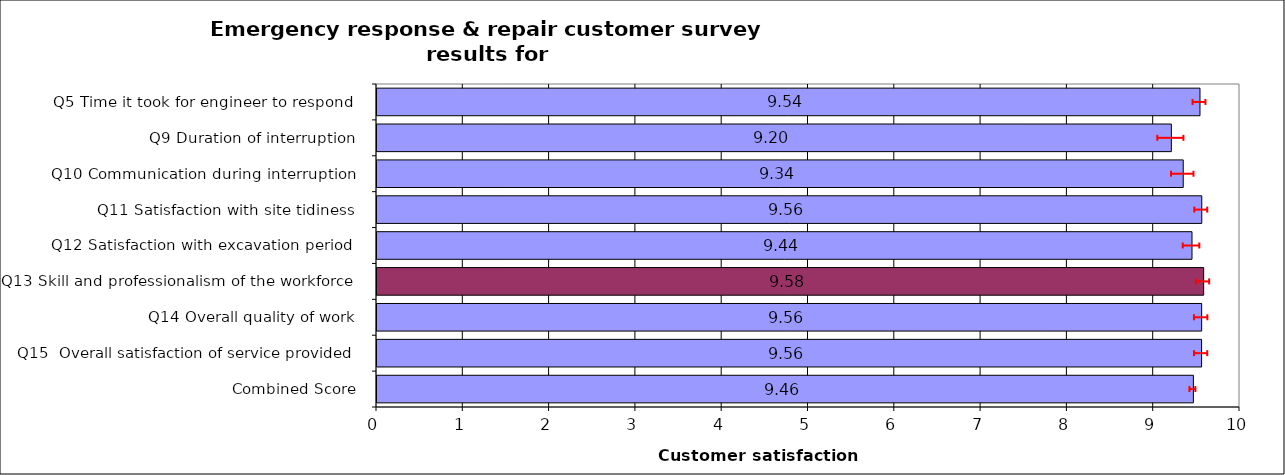
| Category | Series 0 |
|---|---|
| Q5 Time it took for engineer to respond | 9.536 |
| Q9 Duration of interruption | 9.205 |
| Q10 Communication during interruption | 9.342 |
| Q11 Satisfaction with site tidiness | 9.557 |
| Q12 Satisfaction with excavation period | 9.444 |
| Q13 Skill and professionalism of the workforce | 9.579 |
| Q14 Overall quality of work | 9.556 |
| Q15  Overall satisfaction of service provided | 9.555 |
| Combined Score | 9.46 |